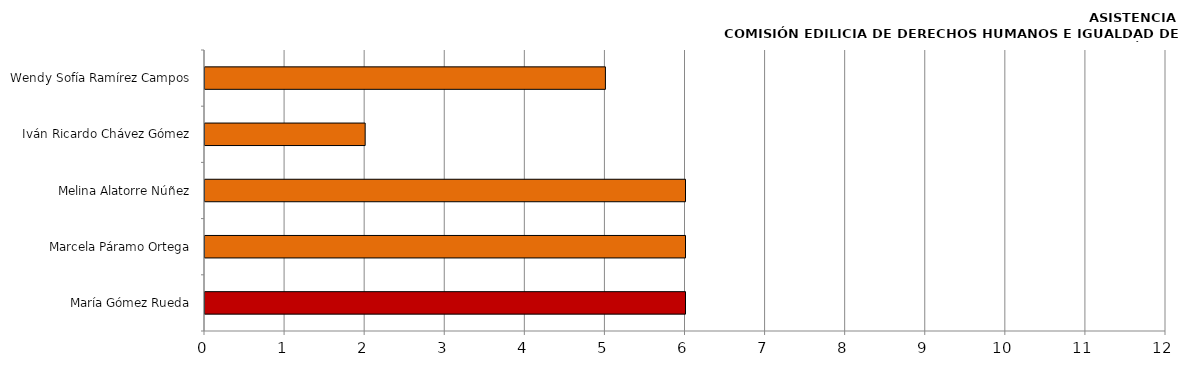
| Category | Series 0 |
|---|---|
| María Gómez Rueda | 6 |
| Marcela Páramo Ortega | 6 |
| Melina Alatorre Núñez | 6 |
| Iván Ricardo Chávez Gómez | 2 |
| Wendy Sofía Ramírez Campos | 5 |